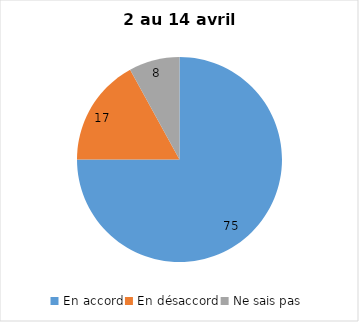
| Category | Series 0 |
|---|---|
| En accord | 75 |
| En désaccord | 17 |
| Ne sais pas | 8 |